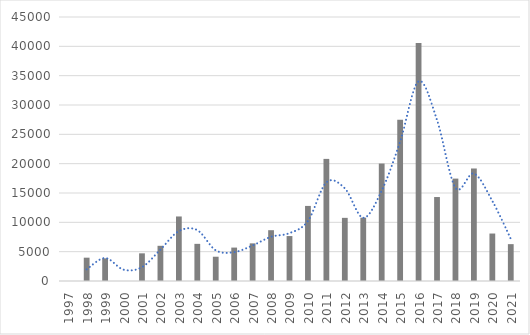
| Category | Total |
|---|---|
| 1997 | 0 |
| 1998 | 3975.57 |
| 1999 | 3860.42 |
| 2000 | 0 |
| 2001 | 4716.27 |
| 2002 | 6000 |
| 2003 | 11000 |
| 2004 | 6331.818 |
| 2005 | 4137.5 |
| 2006 | 5696.471 |
| 2007 | 6417.368 |
| 2008 | 8659.976 |
| 2009 | 7659.972 |
| 2010 | 12797.391 |
| 2011 | 20814.571 |
| 2012 | 10763.636 |
| 2013 | 10793.023 |
| 2014 | 20021.932 |
| 2015 | 27501.977 |
| 2016 | 40561.054 |
| 2017 | 14312.211 |
| 2018 | 17454.833 |
| 2019 | 19179.093 |
| 2020 | 8091.966 |
| 2021 | 6283.333 |